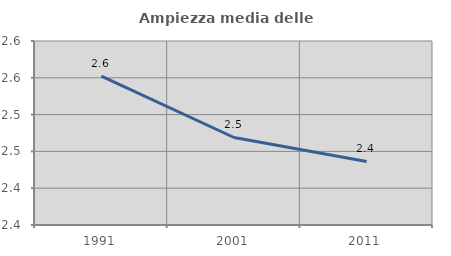
| Category | Ampiezza media delle famiglie |
|---|---|
| 1991.0 | 2.552 |
| 2001.0 | 2.469 |
| 2011.0 | 2.436 |